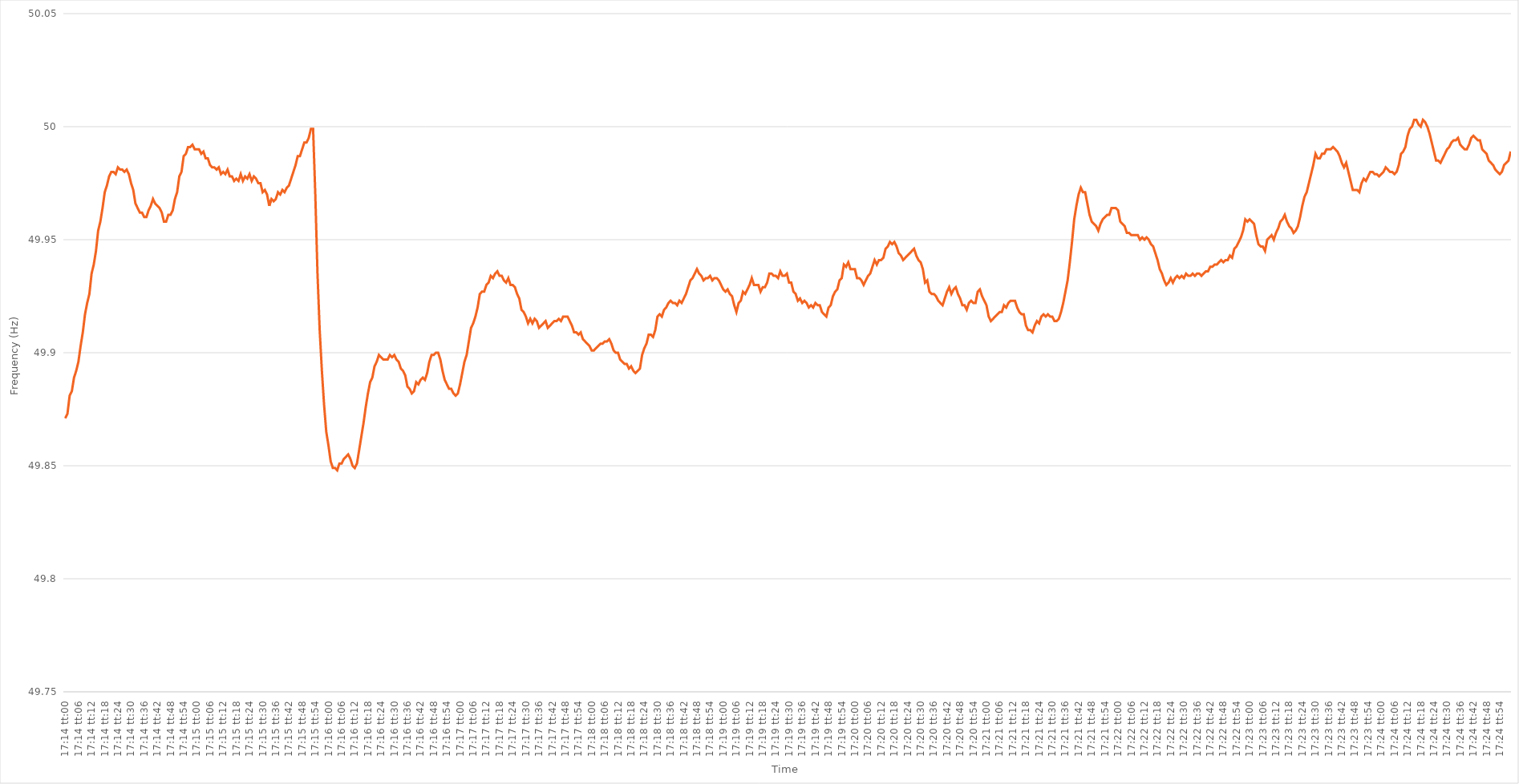
| Category | Series 0 |
|---|---|
| 0.7180555555555556 | 49.871 |
| 0.7180671296296296 | 49.873 |
| 0.7180787037037036 | 49.881 |
| 0.7180902777777778 | 49.883 |
| 0.7181018518518519 | 49.889 |
| 0.7181134259259259 | 49.892 |
| 0.718125 | 49.896 |
| 0.718136574074074 | 49.903 |
| 0.7181481481481482 | 49.909 |
| 0.7181597222222221 | 49.917 |
| 0.7181712962962963 | 49.922 |
| 0.7181828703703704 | 49.926 |
| 0.7181944444444445 | 49.935 |
| 0.7182060185185185 | 49.939 |
| 0.7182175925925925 | 49.945 |
| 0.7182291666666667 | 49.954 |
| 0.7182407407407408 | 49.958 |
| 0.7182523148148148 | 49.964 |
| 0.7182638888888889 | 49.971 |
| 0.718275462962963 | 49.974 |
| 0.718287037037037 | 49.978 |
| 0.718298611111111 | 49.98 |
| 0.7183101851851852 | 49.98 |
| 0.7183217592592593 | 49.979 |
| 0.7183333333333333 | 49.982 |
| 0.7183449074074074 | 49.981 |
| 0.7183564814814815 | 49.981 |
| 0.7183680555555556 | 49.98 |
| 0.7183796296296295 | 49.981 |
| 0.7183912037037037 | 49.979 |
| 0.7184027777777778 | 49.975 |
| 0.7184143518518519 | 49.972 |
| 0.7184259259259259 | 49.966 |
| 0.7184375 | 49.964 |
| 0.7184490740740741 | 49.962 |
| 0.7184606481481483 | 49.962 |
| 0.7184722222222222 | 49.96 |
| 0.7184837962962963 | 49.96 |
| 0.7184953703703704 | 49.963 |
| 0.7185069444444445 | 49.965 |
| 0.7185185185185184 | 49.968 |
| 0.7185300925925926 | 49.966 |
| 0.7185416666666667 | 49.965 |
| 0.7185532407407407 | 49.964 |
| 0.7185648148148148 | 49.962 |
| 0.7185763888888889 | 49.958 |
| 0.718587962962963 | 49.958 |
| 0.7185995370370369 | 49.961 |
| 0.7186111111111111 | 49.961 |
| 0.7186226851851852 | 49.963 |
| 0.7186342592592593 | 49.968 |
| 0.7186458333333333 | 49.971 |
| 0.7186574074074074 | 49.978 |
| 0.7186689814814815 | 49.98 |
| 0.7186805555555557 | 49.987 |
| 0.7186921296296296 | 49.988 |
| 0.7187037037037037 | 49.991 |
| 0.7187152777777778 | 49.991 |
| 0.7187268518518519 | 49.992 |
| 0.7187384259259259 | 49.99 |
| 0.71875 | 49.99 |
| 0.7187615740740741 | 49.99 |
| 0.7187731481481481 | 49.988 |
| 0.7187847222222222 | 49.989 |
| 0.7187962962962963 | 49.986 |
| 0.7188078703703704 | 49.986 |
| 0.7188194444444443 | 49.983 |
| 0.7188310185185185 | 49.982 |
| 0.7188425925925926 | 49.982 |
| 0.7188541666666667 | 49.981 |
| 0.7188657407407407 | 49.982 |
| 0.7188773148148148 | 49.979 |
| 0.7188888888888889 | 49.98 |
| 0.7189004629629631 | 49.979 |
| 0.718912037037037 | 49.981 |
| 0.7189236111111111 | 49.978 |
| 0.7189351851851852 | 49.978 |
| 0.7189467592592593 | 49.976 |
| 0.7189583333333333 | 49.977 |
| 0.7189699074074074 | 49.976 |
| 0.7189814814814816 | 49.979 |
| 0.7189930555555555 | 49.976 |
| 0.7190046296296296 | 49.978 |
| 0.7190162037037037 | 49.977 |
| 0.7190277777777778 | 49.979 |
| 0.7190393518518517 | 49.976 |
| 0.7190509259259259 | 49.978 |
| 0.7190625 | 49.977 |
| 0.7190740740740741 | 49.975 |
| 0.7190856481481481 | 49.975 |
| 0.7190972222222222 | 49.971 |
| 0.7191087962962963 | 49.972 |
| 0.7191203703703705 | 49.97 |
| 0.7191319444444444 | 49.965 |
| 0.7191435185185185 | 49.968 |
| 0.7191550925925926 | 49.967 |
| 0.7191666666666667 | 49.968 |
| 0.7191782407407407 | 49.971 |
| 0.7191898148148148 | 49.97 |
| 0.719201388888889 | 49.972 |
| 0.719212962962963 | 49.971 |
| 0.719224537037037 | 49.973 |
| 0.7192361111111111 | 49.974 |
| 0.7192476851851852 | 49.977 |
| 0.7192592592592592 | 49.98 |
| 0.7192708333333333 | 49.983 |
| 0.7192824074074075 | 49.987 |
| 0.7192939814814815 | 49.987 |
| 0.7193055555555555 | 49.99 |
| 0.7193171296296296 | 49.993 |
| 0.7193287037037037 | 49.993 |
| 0.7193402777777779 | 49.995 |
| 0.7193518518518518 | 49.999 |
| 0.719363425925926 | 49.999 |
| 0.719375 | 49.97 |
| 0.7193865740740741 | 49.935 |
| 0.7193981481481481 | 49.91 |
| 0.7194097222222222 | 49.892 |
| 0.7194212962962964 | 49.877 |
| 0.7194328703703704 | 49.865 |
| 0.7194444444444444 | 49.859 |
| 0.7194560185185185 | 49.852 |
| 0.7194675925925926 | 49.849 |
| 0.7194791666666666 | 49.849 |
| 0.7194907407407407 | 49.848 |
| 0.7195023148148149 | 49.851 |
| 0.7195138888888889 | 49.851 |
| 0.7195254629629629 | 49.853 |
| 0.719537037037037 | 49.854 |
| 0.7195486111111111 | 49.855 |
| 0.7195601851851853 | 49.853 |
| 0.7195717592592592 | 49.85 |
| 0.7195833333333334 | 49.849 |
| 0.7195949074074074 | 49.851 |
| 0.7196064814814815 | 49.857 |
| 0.7196180555555555 | 49.863 |
| 0.7196296296296296 | 49.869 |
| 0.7196412037037038 | 49.876 |
| 0.7196527777777778 | 49.882 |
| 0.7196643518518518 | 49.887 |
| 0.7196759259259259 | 49.889 |
| 0.7196875 | 49.894 |
| 0.719699074074074 | 49.896 |
| 0.7197106481481481 | 49.899 |
| 0.7197222222222223 | 49.898 |
| 0.7197337962962963 | 49.897 |
| 0.7197453703703703 | 49.897 |
| 0.7197569444444444 | 49.897 |
| 0.7197685185185185 | 49.899 |
| 0.7197800925925927 | 49.898 |
| 0.7197916666666666 | 49.899 |
| 0.7198032407407408 | 49.897 |
| 0.7198148148148148 | 49.896 |
| 0.719826388888889 | 49.893 |
| 0.7198379629629629 | 49.892 |
| 0.719849537037037 | 49.89 |
| 0.7198611111111112 | 49.885 |
| 0.7198726851851852 | 49.884 |
| 0.7198842592592593 | 49.882 |
| 0.7198958333333333 | 49.883 |
| 0.7199074074074074 | 49.887 |
| 0.7199189814814816 | 49.886 |
| 0.7199305555555555 | 49.888 |
| 0.7199421296296297 | 49.889 |
| 0.7199537037037037 | 49.888 |
| 0.7199652777777777 | 49.891 |
| 0.7199768518518518 | 49.896 |
| 0.7199884259259259 | 49.899 |
| 0.7200000000000001 | 49.899 |
| 0.720011574074074 | 49.9 |
| 0.7200231481481482 | 49.9 |
| 0.7200347222222222 | 49.897 |
| 0.7200462962962964 | 49.892 |
| 0.7200578703703703 | 49.888 |
| 0.7200694444444444 | 49.886 |
| 0.7200810185185186 | 49.884 |
| 0.7200925925925926 | 49.884 |
| 0.7201041666666667 | 49.882 |
| 0.7201157407407407 | 49.881 |
| 0.7201273148148148 | 49.882 |
| 0.720138888888889 | 49.886 |
| 0.7201504629629629 | 49.891 |
| 0.7201620370370371 | 49.896 |
| 0.7201736111111111 | 49.899 |
| 0.7201851851851852 | 49.905 |
| 0.7201967592592592 | 49.911 |
| 0.7202083333333333 | 49.913 |
| 0.7202199074074075 | 49.916 |
| 0.7202314814814814 | 49.92 |
| 0.7202430555555556 | 49.926 |
| 0.7202546296296296 | 49.927 |
| 0.7202662037037038 | 49.927 |
| 0.7202777777777777 | 49.93 |
| 0.7202893518518518 | 49.931 |
| 0.720300925925926 | 49.934 |
| 0.7203125 | 49.933 |
| 0.7203240740740741 | 49.935 |
| 0.7203356481481481 | 49.936 |
| 0.7203472222222222 | 49.934 |
| 0.7203587962962964 | 49.934 |
| 0.7203703703703703 | 49.932 |
| 0.7203819444444445 | 49.931 |
| 0.7203935185185185 | 49.933 |
| 0.7204050925925927 | 49.93 |
| 0.7204166666666666 | 49.93 |
| 0.7204282407407407 | 49.929 |
| 0.7204398148148149 | 49.926 |
| 0.7204513888888888 | 49.924 |
| 0.720462962962963 | 49.919 |
| 0.720474537037037 | 49.918 |
| 0.7204861111111112 | 49.916 |
| 0.7204976851851851 | 49.913 |
| 0.7205092592592592 | 49.915 |
| 0.7205208333333334 | 49.913 |
| 0.7205324074074074 | 49.915 |
| 0.7205439814814815 | 49.914 |
| 0.7205555555555555 | 49.911 |
| 0.7205671296296297 | 49.912 |
| 0.7205787037037038 | 49.913 |
| 0.7205902777777777 | 49.914 |
| 0.7206018518518519 | 49.911 |
| 0.7206134259259259 | 49.912 |
| 0.7206250000000001 | 49.913 |
| 0.720636574074074 | 49.914 |
| 0.7206481481481481 | 49.914 |
| 0.7206597222222223 | 49.915 |
| 0.7206712962962962 | 49.914 |
| 0.7206828703703704 | 49.916 |
| 0.7206944444444444 | 49.916 |
| 0.7207060185185186 | 49.916 |
| 0.7207175925925925 | 49.914 |
| 0.7207291666666666 | 49.912 |
| 0.7207407407407408 | 49.909 |
| 0.7207523148148148 | 49.909 |
| 0.7207638888888889 | 49.908 |
| 0.7207754629629629 | 49.909 |
| 0.7207870370370371 | 49.906 |
| 0.7207986111111112 | 49.905 |
| 0.7208101851851851 | 49.904 |
| 0.7208217592592593 | 49.903 |
| 0.7208333333333333 | 49.901 |
| 0.7208449074074075 | 49.901 |
| 0.7208564814814814 | 49.902 |
| 0.7208680555555556 | 49.903 |
| 0.7208796296296297 | 49.904 |
| 0.7208912037037036 | 49.904 |
| 0.7209027777777778 | 49.905 |
| 0.7209143518518518 | 49.905 |
| 0.720925925925926 | 49.906 |
| 0.7209374999999999 | 49.904 |
| 0.720949074074074 | 49.901 |
| 0.7209606481481482 | 49.9 |
| 0.7209722222222222 | 49.9 |
| 0.7209837962962963 | 49.897 |
| 0.7209953703703703 | 49.896 |
| 0.7210069444444445 | 49.895 |
| 0.7210185185185186 | 49.895 |
| 0.7210300925925925 | 49.893 |
| 0.7210416666666667 | 49.894 |
| 0.7210532407407407 | 49.892 |
| 0.7210648148148149 | 49.891 |
| 0.7210763888888888 | 49.892 |
| 0.721087962962963 | 49.893 |
| 0.7210995370370371 | 49.899 |
| 0.721111111111111 | 49.902 |
| 0.7211226851851852 | 49.904 |
| 0.7211342592592592 | 49.908 |
| 0.7211458333333334 | 49.908 |
| 0.7211574074074073 | 49.907 |
| 0.7211689814814815 | 49.91 |
| 0.7211805555555556 | 49.916 |
| 0.7211921296296296 | 49.917 |
| 0.7212037037037037 | 49.916 |
| 0.7212152777777777 | 49.919 |
| 0.7212268518518519 | 49.92 |
| 0.721238425925926 | 49.922 |
| 0.72125 | 49.923 |
| 0.7212615740740741 | 49.922 |
| 0.7212731481481481 | 49.922 |
| 0.7212847222222223 | 49.921 |
| 0.7212962962962962 | 49.923 |
| 0.7213078703703704 | 49.922 |
| 0.7213194444444445 | 49.924 |
| 0.7213310185185186 | 49.926 |
| 0.7213425925925926 | 49.929 |
| 0.7213541666666666 | 49.932 |
| 0.7213657407407408 | 49.933 |
| 0.7213773148148147 | 49.935 |
| 0.7213888888888889 | 49.937 |
| 0.721400462962963 | 49.935 |
| 0.721412037037037 | 49.934 |
| 0.7214236111111111 | 49.932 |
| 0.7214351851851851 | 49.933 |
| 0.7214467592592593 | 49.933 |
| 0.7214583333333334 | 49.934 |
| 0.7214699074074074 | 49.932 |
| 0.7214814814814815 | 49.933 |
| 0.7214930555555555 | 49.933 |
| 0.7215046296296297 | 49.932 |
| 0.7215162037037036 | 49.93 |
| 0.7215277777777778 | 49.928 |
| 0.7215393518518519 | 49.927 |
| 0.721550925925926 | 49.928 |
| 0.7215625 | 49.926 |
| 0.721574074074074 | 49.925 |
| 0.7215856481481482 | 49.921 |
| 0.7215972222222223 | 49.918 |
| 0.7216087962962963 | 49.922 |
| 0.7216203703703704 | 49.923 |
| 0.7216319444444445 | 49.927 |
| 0.7216435185185185 | 49.926 |
| 0.7216550925925925 | 49.928 |
| 0.7216666666666667 | 49.93 |
| 0.7216782407407408 | 49.933 |
| 0.7216898148148148 | 49.93 |
| 0.7217013888888889 | 49.93 |
| 0.721712962962963 | 49.93 |
| 0.7217245370370371 | 49.927 |
| 0.721736111111111 | 49.929 |
| 0.7217476851851852 | 49.929 |
| 0.7217592592592593 | 49.931 |
| 0.7217708333333334 | 49.935 |
| 0.7217824074074074 | 49.935 |
| 0.7217939814814814 | 49.934 |
| 0.7218055555555556 | 49.934 |
| 0.7218171296296297 | 49.933 |
| 0.7218287037037037 | 49.936 |
| 0.7218402777777778 | 49.934 |
| 0.7218518518518519 | 49.934 |
| 0.7218634259259259 | 49.935 |
| 0.7218749999999999 | 49.931 |
| 0.7218865740740741 | 49.931 |
| 0.7218981481481482 | 49.927 |
| 0.7219097222222222 | 49.926 |
| 0.7219212962962963 | 49.923 |
| 0.7219328703703703 | 49.924 |
| 0.7219444444444445 | 49.922 |
| 0.7219560185185184 | 49.923 |
| 0.7219675925925926 | 49.922 |
| 0.7219791666666667 | 49.92 |
| 0.7219907407407408 | 49.921 |
| 0.7220023148148148 | 49.92 |
| 0.7220138888888888 | 49.922 |
| 0.722025462962963 | 49.921 |
| 0.7220370370370371 | 49.921 |
| 0.7220486111111111 | 49.918 |
| 0.7220601851851852 | 49.917 |
| 0.7220717592592593 | 49.916 |
| 0.7220833333333333 | 49.92 |
| 0.7220949074074073 | 49.921 |
| 0.7221064814814815 | 49.925 |
| 0.7221180555555556 | 49.927 |
| 0.7221296296296296 | 49.928 |
| 0.7221412037037037 | 49.932 |
| 0.7221527777777778 | 49.933 |
| 0.7221643518518519 | 49.939 |
| 0.7221759259259258 | 49.938 |
| 0.7221875 | 49.94 |
| 0.7221990740740741 | 49.937 |
| 0.7222106481481482 | 49.937 |
| 0.7222222222222222 | 49.937 |
| 0.7222337962962962 | 49.933 |
| 0.7222453703703704 | 49.933 |
| 0.7222569444444445 | 49.932 |
| 0.7222685185185185 | 49.93 |
| 0.7222800925925926 | 49.932 |
| 0.7222916666666667 | 49.934 |
| 0.7223032407407407 | 49.935 |
| 0.7223148148148147 | 49.938 |
| 0.7223263888888889 | 49.941 |
| 0.722337962962963 | 49.939 |
| 0.722349537037037 | 49.941 |
| 0.7223611111111111 | 49.941 |
| 0.7223726851851852 | 49.942 |
| 0.7223842592592593 | 49.946 |
| 0.7223958333333332 | 49.947 |
| 0.7224074074074074 | 49.949 |
| 0.7224189814814815 | 49.948 |
| 0.7224305555555556 | 49.949 |
| 0.7224421296296296 | 49.947 |
| 0.7224537037037037 | 49.944 |
| 0.7224652777777778 | 49.943 |
| 0.722476851851852 | 49.941 |
| 0.7224884259259259 | 49.942 |
| 0.7225 | 49.943 |
| 0.7225115740740741 | 49.944 |
| 0.7225231481481482 | 49.945 |
| 0.7225347222222221 | 49.946 |
| 0.7225462962962963 | 49.943 |
| 0.7225578703703704 | 49.941 |
| 0.7225694444444444 | 49.94 |
| 0.7225810185185185 | 49.937 |
| 0.7225925925925926 | 49.931 |
| 0.7226041666666667 | 49.932 |
| 0.7226157407407406 | 49.927 |
| 0.7226273148148148 | 49.926 |
| 0.7226388888888889 | 49.926 |
| 0.722650462962963 | 49.925 |
| 0.722662037037037 | 49.923 |
| 0.7226736111111111 | 49.922 |
| 0.7226851851851852 | 49.921 |
| 0.7226967592592594 | 49.924 |
| 0.7227083333333333 | 49.927 |
| 0.7227199074074074 | 49.929 |
| 0.7227314814814815 | 49.926 |
| 0.7227430555555556 | 49.928 |
| 0.7227546296296296 | 49.929 |
| 0.7227662037037037 | 49.926 |
| 0.7227777777777779 | 49.924 |
| 0.7227893518518518 | 49.921 |
| 0.7228009259259259 | 49.921 |
| 0.7228125 | 49.919 |
| 0.7228240740740741 | 49.922 |
| 0.722835648148148 | 49.923 |
| 0.7228472222222222 | 49.922 |
| 0.7228587962962963 | 49.922 |
| 0.7228703703703704 | 49.927 |
| 0.7228819444444444 | 49.928 |
| 0.7228935185185185 | 49.925 |
| 0.7229050925925926 | 49.923 |
| 0.7229166666666668 | 49.921 |
| 0.7229282407407407 | 49.916 |
| 0.7229398148148148 | 49.914 |
| 0.7229513888888889 | 49.915 |
| 0.722962962962963 | 49.916 |
| 0.722974537037037 | 49.917 |
| 0.7229861111111111 | 49.918 |
| 0.7229976851851853 | 49.918 |
| 0.7230092592592593 | 49.921 |
| 0.7230208333333333 | 49.92 |
| 0.7230324074074074 | 49.922 |
| 0.7230439814814815 | 49.923 |
| 0.7230555555555555 | 49.923 |
| 0.7230671296296296 | 49.923 |
| 0.7230787037037038 | 49.92 |
| 0.7230902777777778 | 49.918 |
| 0.7231018518518518 | 49.917 |
| 0.7231134259259259 | 49.917 |
| 0.723125 | 49.912 |
| 0.7231365740740742 | 49.91 |
| 0.7231481481481481 | 49.91 |
| 0.7231597222222222 | 49.909 |
| 0.7231712962962963 | 49.912 |
| 0.7231828703703704 | 49.914 |
| 0.7231944444444444 | 49.913 |
| 0.7232060185185185 | 49.916 |
| 0.7232175925925927 | 49.917 |
| 0.7232291666666667 | 49.916 |
| 0.7232407407407407 | 49.917 |
| 0.7232523148148148 | 49.916 |
| 0.7232638888888889 | 49.916 |
| 0.7232754629629629 | 49.914 |
| 0.723287037037037 | 49.914 |
| 0.7232986111111112 | 49.915 |
| 0.7233101851851852 | 49.918 |
| 0.7233217592592592 | 49.922 |
| 0.7233333333333333 | 49.927 |
| 0.7233449074074074 | 49.932 |
| 0.7233564814814816 | 49.94 |
| 0.7233680555555555 | 49.949 |
| 0.7233796296296297 | 49.959 |
| 0.7233912037037037 | 49.965 |
| 0.7234027777777778 | 49.97 |
| 0.7234143518518518 | 49.973 |
| 0.7234259259259259 | 49.971 |
| 0.7234375000000001 | 49.971 |
| 0.7234490740740741 | 49.966 |
| 0.7234606481481481 | 49.961 |
| 0.7234722222222222 | 49.958 |
| 0.7234837962962963 | 49.957 |
| 0.7234953703703703 | 49.956 |
| 0.7235069444444444 | 49.954 |
| 0.7235185185185186 | 49.957 |
| 0.7235300925925926 | 49.959 |
| 0.7235416666666666 | 49.96 |
| 0.7235532407407407 | 49.961 |
| 0.7235648148148148 | 49.961 |
| 0.723576388888889 | 49.964 |
| 0.7235879629629629 | 49.964 |
| 0.723599537037037 | 49.964 |
| 0.7236111111111111 | 49.963 |
| 0.7236226851851852 | 49.958 |
| 0.7236342592592592 | 49.957 |
| 0.7236458333333333 | 49.956 |
| 0.7236574074074075 | 49.953 |
| 0.7236689814814815 | 49.953 |
| 0.7236805555555555 | 49.952 |
| 0.7236921296296296 | 49.952 |
| 0.7237037037037037 | 49.952 |
| 0.7237152777777777 | 49.952 |
| 0.7237268518518518 | 49.95 |
| 0.723738425925926 | 49.951 |
| 0.72375 | 49.95 |
| 0.723761574074074 | 49.951 |
| 0.7237731481481481 | 49.95 |
| 0.7237847222222222 | 49.948 |
| 0.7237962962962964 | 49.947 |
| 0.7238078703703703 | 49.944 |
| 0.7238194444444445 | 49.941 |
| 0.7238310185185185 | 49.937 |
| 0.7238425925925926 | 49.935 |
| 0.7238541666666666 | 49.932 |
| 0.7238657407407407 | 49.93 |
| 0.7238773148148149 | 49.931 |
| 0.7238888888888889 | 49.933 |
| 0.723900462962963 | 49.931 |
| 0.723912037037037 | 49.933 |
| 0.7239236111111111 | 49.934 |
| 0.7239351851851853 | 49.933 |
| 0.7239467592592592 | 49.934 |
| 0.7239583333333334 | 49.933 |
| 0.7239699074074074 | 49.935 |
| 0.7239814814814814 | 49.934 |
| 0.7239930555555555 | 49.934 |
| 0.7240046296296296 | 49.935 |
| 0.7240162037037038 | 49.934 |
| 0.7240277777777777 | 49.935 |
| 0.7240393518518519 | 49.935 |
| 0.7240509259259259 | 49.934 |
| 0.7240625 | 49.935 |
| 0.724074074074074 | 49.936 |
| 0.7240856481481481 | 49.936 |
| 0.7240972222222223 | 49.938 |
| 0.7241087962962963 | 49.938 |
| 0.7241203703703704 | 49.939 |
| 0.7241319444444444 | 49.939 |
| 0.7241435185185185 | 49.94 |
| 0.7241550925925927 | 49.941 |
| 0.7241666666666666 | 49.94 |
| 0.7241782407407408 | 49.941 |
| 0.7241898148148148 | 49.941 |
| 0.724201388888889 | 49.943 |
| 0.7242129629629629 | 49.942 |
| 0.724224537037037 | 49.946 |
| 0.7242361111111112 | 49.947 |
| 0.7242476851851851 | 49.949 |
| 0.7242592592592593 | 49.951 |
| 0.7242708333333333 | 49.954 |
| 0.7242824074074075 | 49.959 |
| 0.7242939814814814 | 49.958 |
| 0.7243055555555555 | 49.959 |
| 0.7243171296296297 | 49.958 |
| 0.7243287037037037 | 49.957 |
| 0.7243402777777778 | 49.952 |
| 0.7243518518518518 | 49.948 |
| 0.724363425925926 | 49.947 |
| 0.7243750000000001 | 49.947 |
| 0.724386574074074 | 49.945 |
| 0.7243981481481482 | 49.95 |
| 0.7244097222222222 | 49.951 |
| 0.7244212962962964 | 49.952 |
| 0.7244328703703703 | 49.95 |
| 0.7244444444444444 | 49.953 |
| 0.7244560185185186 | 49.955 |
| 0.7244675925925925 | 49.958 |
| 0.7244791666666667 | 49.959 |
| 0.7244907407407407 | 49.961 |
| 0.7245023148148149 | 49.958 |
| 0.7245138888888888 | 49.956 |
| 0.7245254629629629 | 49.955 |
| 0.7245370370370371 | 49.953 |
| 0.7245486111111111 | 49.954 |
| 0.7245601851851852 | 49.956 |
| 0.7245717592592592 | 49.96 |
| 0.7245833333333334 | 49.965 |
| 0.7245949074074075 | 49.969 |
| 0.7246064814814814 | 49.971 |
| 0.7246180555555556 | 49.975 |
| 0.7246296296296296 | 49.979 |
| 0.7246412037037038 | 49.983 |
| 0.7246527777777777 | 49.988 |
| 0.7246643518518519 | 49.986 |
| 0.724675925925926 | 49.986 |
| 0.7246874999999999 | 49.988 |
| 0.7246990740740741 | 49.988 |
| 0.7247106481481481 | 49.99 |
| 0.7247222222222223 | 49.99 |
| 0.7247337962962962 | 49.99 |
| 0.7247453703703703 | 49.991 |
| 0.7247569444444445 | 49.99 |
| 0.7247685185185185 | 49.989 |
| 0.7247800925925926 | 49.987 |
| 0.7247916666666666 | 49.984 |
| 0.7248032407407408 | 49.982 |
| 0.7248148148148149 | 49.984 |
| 0.7248263888888888 | 49.98 |
| 0.724837962962963 | 49.976 |
| 0.724849537037037 | 49.972 |
| 0.7248611111111112 | 49.972 |
| 0.7248726851851851 | 49.972 |
| 0.7248842592592593 | 49.971 |
| 0.7248958333333334 | 49.975 |
| 0.7249074074074073 | 49.977 |
| 0.7249189814814815 | 49.976 |
| 0.7249305555555555 | 49.978 |
| 0.7249421296296297 | 49.98 |
| 0.7249537037037036 | 49.98 |
| 0.7249652777777778 | 49.979 |
| 0.7249768518518519 | 49.979 |
| 0.7249884259259259 | 49.978 |
| 0.725 | 49.979 |
| 0.725011574074074 | 49.98 |
| 0.7250231481481482 | 49.982 |
| 0.7250347222222223 | 49.981 |
| 0.7250462962962962 | 49.98 |
| 0.7250578703703704 | 49.98 |
| 0.7250694444444444 | 49.979 |
| 0.7250810185185186 | 49.98 |
| 0.7250925925925925 | 49.983 |
| 0.7251041666666667 | 49.988 |
| 0.7251157407407408 | 49.989 |
| 0.7251273148148148 | 49.991 |
| 0.7251388888888889 | 49.996 |
| 0.7251504629629629 | 49.999 |
| 0.7251620370370371 | 50 |
| 0.725173611111111 | 50.003 |
| 0.7251851851851852 | 50.003 |
| 0.7251967592592593 | 50.001 |
| 0.7252083333333333 | 50 |
| 0.7252199074074074 | 50.003 |
| 0.7252314814814814 | 50.002 |
| 0.7252430555555556 | 50 |
| 0.7252546296296297 | 49.997 |
| 0.7252662037037036 | 49.993 |
| 0.7252777777777778 | 49.989 |
| 0.7252893518518518 | 49.985 |
| 0.725300925925926 | 49.985 |
| 0.7253124999999999 | 49.984 |
| 0.7253240740740741 | 49.986 |
| 0.7253356481481482 | 49.988 |
| 0.7253472222222223 | 49.99 |
| 0.7253587962962963 | 49.991 |
| 0.7253703703703703 | 49.993 |
| 0.7253819444444445 | 49.994 |
| 0.7253935185185184 | 49.994 |
| 0.7254050925925926 | 49.995 |
| 0.7254166666666667 | 49.992 |
| 0.7254282407407407 | 49.991 |
| 0.7254398148148148 | 49.99 |
| 0.7254513888888888 | 49.99 |
| 0.725462962962963 | 49.992 |
| 0.7254745370370371 | 49.995 |
| 0.725486111111111 | 49.996 |
| 0.7254976851851852 | 49.995 |
| 0.7255092592592592 | 49.994 |
| 0.7255208333333334 | 49.994 |
| 0.7255324074074073 | 49.99 |
| 0.7255439814814815 | 49.989 |
| 0.7255555555555556 | 49.988 |
| 0.7255671296296297 | 49.985 |
| 0.7255787037037037 | 49.984 |
| 0.7255902777777777 | 49.983 |
| 0.7256018518518519 | 49.981 |
| 0.725613425925926 | 49.98 |
| 0.725625 | 49.979 |
| 0.7256365740740741 | 49.98 |
| 0.7256481481481482 | 49.983 |
| 0.7256597222222222 | 49.984 |
| 0.7256712962962962 | 49.985 |
| 0.7256828703703704 | 49.989 |